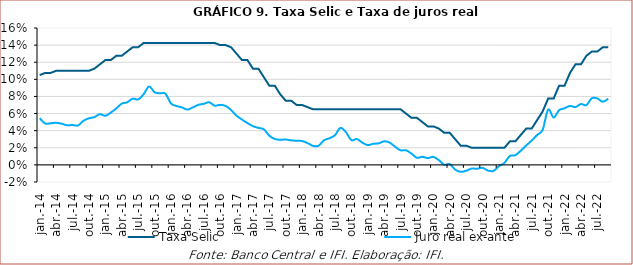
| Category | Taxa Selic | Juro real ex-ante |
|---|---|---|
| 2014-01-01 | 0.105 | 0.055 |
| 2014-02-01 | 0.108 | 0.048 |
| 2014-03-01 | 0.108 | 0.049 |
| 2014-04-01 | 0.11 | 0.049 |
| 2014-05-01 | 0.11 | 0.048 |
| 2014-06-01 | 0.11 | 0.046 |
| 2014-07-01 | 0.11 | 0.047 |
| 2014-08-01 | 0.11 | 0.046 |
| 2014-09-01 | 0.11 | 0.052 |
| 2014-10-01 | 0.11 | 0.054 |
| 2014-11-01 | 0.112 | 0.056 |
| 2014-12-01 | 0.118 | 0.059 |
| 2015-01-01 | 0.122 | 0.057 |
| 2015-02-01 | 0.122 | 0.061 |
| 2015-03-01 | 0.128 | 0.066 |
| 2015-04-01 | 0.128 | 0.072 |
| 2015-05-01 | 0.132 | 0.073 |
| 2015-06-01 | 0.138 | 0.077 |
| 2015-07-01 | 0.138 | 0.076 |
| 2015-08-01 | 0.142 | 0.083 |
| 2015-09-01 | 0.142 | 0.092 |
| 2015-10-01 | 0.142 | 0.085 |
| 2015-11-01 | 0.142 | 0.084 |
| 2015-12-01 | 0.142 | 0.083 |
| 2016-01-01 | 0.142 | 0.072 |
| 2016-02-01 | 0.142 | 0.069 |
| 2016-03-01 | 0.142 | 0.067 |
| 2016-04-01 | 0.142 | 0.065 |
| 2016-05-01 | 0.142 | 0.067 |
| 2016-06-01 | 0.142 | 0.07 |
| 2016-07-01 | 0.142 | 0.071 |
| 2016-08-01 | 0.142 | 0.073 |
| 2016-09-01 | 0.142 | 0.069 |
| 2016-10-01 | 0.14 | 0.07 |
| 2016-11-01 | 0.14 | 0.069 |
| 2016-12-01 | 0.138 | 0.064 |
| 2017-01-01 | 0.13 | 0.058 |
| 2017-02-01 | 0.122 | 0.053 |
| 2017-03-01 | 0.122 | 0.049 |
| 2017-04-01 | 0.112 | 0.045 |
| 2017-05-01 | 0.112 | 0.043 |
| 2017-06-01 | 0.102 | 0.042 |
| 2017-07-01 | 0.092 | 0.034 |
| 2017-08-01 | 0.092 | 0.03 |
| 2017-09-01 | 0.082 | 0.029 |
| 2017-10-01 | 0.075 | 0.03 |
| 2017-11-01 | 0.075 | 0.029 |
| 2017-12-01 | 0.07 | 0.028 |
| 2018-01-01 | 0.07 | 0.028 |
| 2018-02-01 | 0.068 | 0.025 |
| 2018-03-01 | 0.065 | 0.022 |
| 2018-04-01 | 0.065 | 0.022 |
| 2018-05-01 | 0.065 | 0.029 |
| 2018-06-01 | 0.065 | 0.031 |
| 2018-07-01 | 0.065 | 0.035 |
| 2018-08-01 | 0.065 | 0.043 |
| 2018-09-01 | 0.065 | 0.038 |
| 2018-10-01 | 0.065 | 0.029 |
| 2018-11-01 | 0.065 | 0.03 |
| 2018-12-01 | 0.065 | 0.026 |
| 2019-01-01 | 0.065 | 0.023 |
| 2019-02-01 | 0.065 | 0.025 |
| 2019-03-01 | 0.065 | 0.025 |
| 2019-04-01 | 0.065 | 0.028 |
| 2019-05-01 | 0.065 | 0.026 |
| 2019-06-01 | 0.065 | 0.021 |
| 2019-07-01 | 0.065 | 0.017 |
| 2019-08-01 | 0.06 | 0.017 |
| 2019-09-01 | 0.055 | 0.013 |
| 2019-10-01 | 0.055 | 0.008 |
| 2019-11-01 | 0.05 | 0.009 |
| 2019-12-01 | 0.045 | 0.008 |
| 2020-01-01 | 0.045 | 0.009 |
| 2020-02-01 | 0.042 | 0.006 |
| 2020-03-01 | 0.038 | 0 |
| 2020-04-01 | 0.038 | 0.001 |
| 2020-05-01 | 0.03 | -0.006 |
| 2020-06-01 | 0.022 | -0.008 |
| 2020-07-01 | 0.022 | -0.007 |
| 2020-08-01 | 0.02 | -0.004 |
| 2020-09-01 | 0.02 | -0.004 |
| 2020-10-01 | 0.02 | -0.003 |
| 2020-11-01 | 0.02 | -0.007 |
| 2020-12-01 | 0.02 | -0.007 |
| 2021-01-01 | 0.02 | -0.002 |
| 2021-02-01 | 0.02 | 0.002 |
| 2021-03-01 | 0.028 | 0.01 |
| 2021-04-01 | 0.028 | 0.011 |
| 2021-05-01 | 0.035 | 0.017 |
| 2021-06-01 | 0.042 | 0.023 |
| 2021-07-01 | 0.042 | 0.029 |
| 2021-08-01 | 0.052 | 0.035 |
| 2021-09-01 | 0.062 | 0.041 |
| 2021-10-01 | 0.078 | 0.065 |
| 2021-11-01 | 0.078 | 0.055 |
| 2021-12-01 | 0.092 | 0.064 |
| 2022-01-01 | 0.092 | 0.066 |
| 2022-02-01 | 0.108 | 0.069 |
| 2022-03-01 | 0.118 | 0.068 |
| 2022-04-01 | 0.118 | 0.071 |
| 2022-05-01 | 0.128 | 0.07 |
| 2022-06-01 | 0.132 | 0.078 |
| 2022-07-01 | 0.132 | 0.078 |
| 2022-08-01 | 0.138 | 0.074 |
| 2022-09-01 | 0.138 | 0.077 |